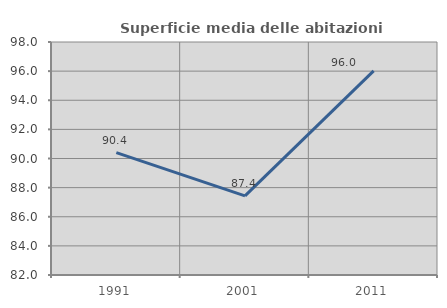
| Category | Superficie media delle abitazioni occupate |
|---|---|
| 1991.0 | 90.403 |
| 2001.0 | 87.431 |
| 2011.0 | 96.014 |